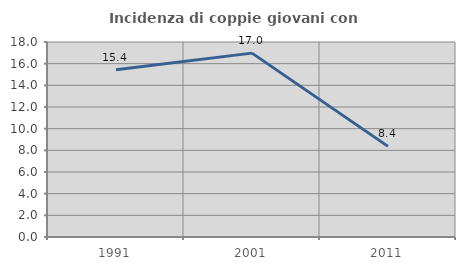
| Category | Incidenza di coppie giovani con figli |
|---|---|
| 1991.0 | 15.429 |
| 2001.0 | 16.972 |
| 2011.0 | 8.365 |